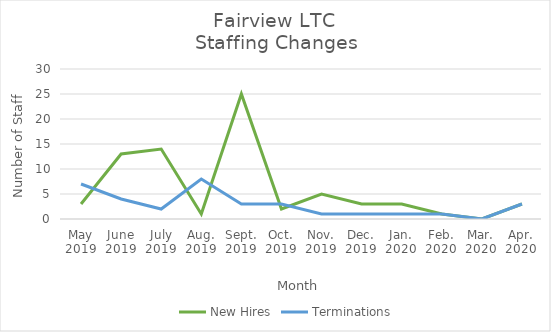
| Category | New Hires | Terminations |
|---|---|---|
| May
2019 | 3 | 7 |
| June
2019 | 13 | 4 |
| July
2019 | 14 | 2 |
| Aug.
2019 | 1 | 8 |
| Sept.
2019 | 25 | 3 |
| Oct.
2019 | 2 | 3 |
| Nov.
2019 | 5 | 1 |
| Dec.
2019 | 3 | 1 |
| Jan.
2020 | 3 | 1 |
| Feb.
2020 | 1 | 1 |
| Mar.
2020 | 0 | 0 |
| Apr.
2020 | 3 | 3 |